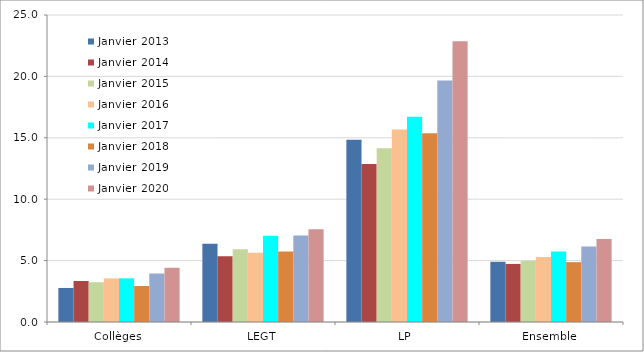
| Category | Janvier 2013 | Janvier 2014 | Janvier 2015 | Janvier 2016 | Janvier 2017 | Janvier 2018 | Janvier 2019 | Janvier 2020 |
|---|---|---|---|---|---|---|---|---|
| Collèges | 2.772 | 3.341 | 3.237 | 3.55 | 3.556 | 2.931 | 3.95 | 4.414 |
| LEGT | 6.376 | 5.36 | 5.915 | 5.648 | 7.029 | 5.737 | 7.05 | 7.559 |
| LP | 14.844 | 12.869 | 14.156 | 15.671 | 16.721 | 15.362 | 19.665 | 22.869 |
| Ensemble | 4.904 | 4.73 | 4.976 | 5.285 | 5.731 | 4.873 | 6.145 | 6.766 |